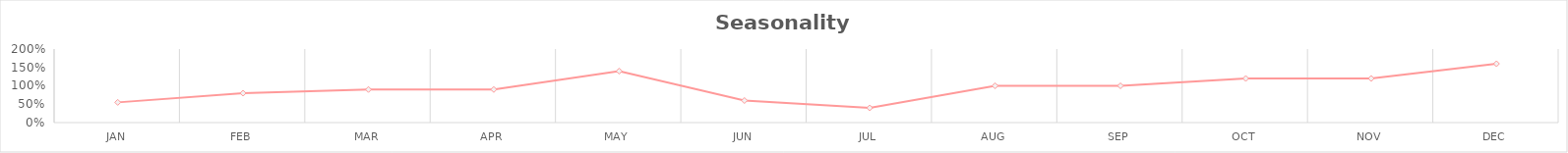
| Category | Series 0 |
|---|---|
| JAN | 0.55 |
| FEB | 0.8 |
| MAR | 0.9 |
| APR | 0.9 |
| MAY | 1.4 |
| JUN | 0.6 |
| JUL | 0.4 |
| AUG | 1 |
| SEP | 1 |
| OCT | 1.2 |
| NOV | 1.2 |
| DEC | 1.6 |